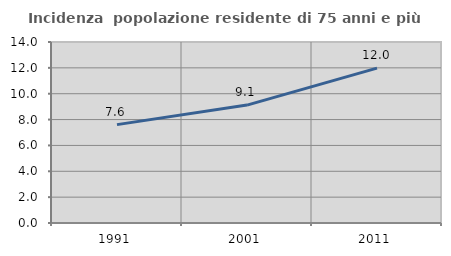
| Category | Incidenza  popolazione residente di 75 anni e più |
|---|---|
| 1991.0 | 7.609 |
| 2001.0 | 9.12 |
| 2011.0 | 11.981 |